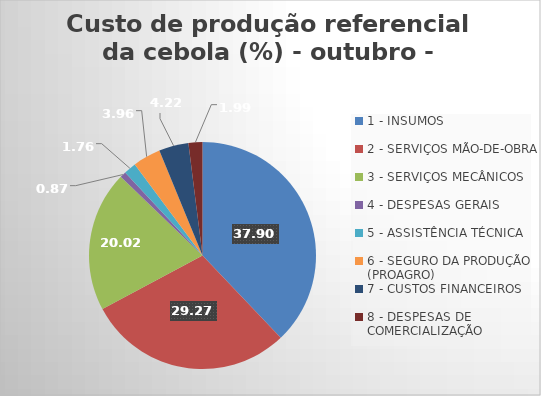
| Category | Series 0 |
|---|---|
| 1 - INSUMOS | 37.902 |
| 2 - SERVIÇOS MÃO-DE-OBRA | 29.275 |
| 3 - SERVIÇOS MECÂNICOS | 20.02 |
| 4 - DESPESAS GERAIS  | 0.872 |
| 5 - ASSISTÊNCIA TÉCNICA | 1.761 |
| 6 - SEGURO DA PRODUÇÃO (PROAGRO) | 3.963 |
| 7 - CUSTOS FINANCEIROS | 4.221 |
| 8 - DESPESAS DE COMERCIALIZAÇÃO | 1.986 |